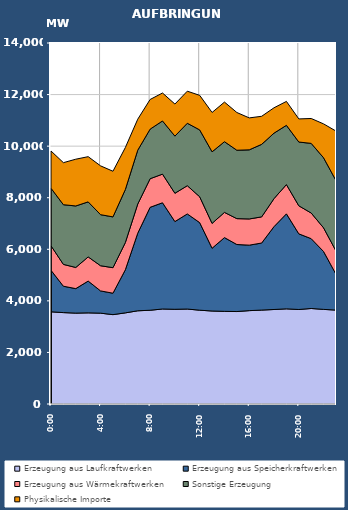
| Category | Erzeugung aus Laufkraftwerken | Erzeugung aus Speicherkraftwerken | Erzeugung aus Wärmekraftwerken | Sonstige Erzeugung | Physikalische Importe |
|---|---|---|---|---|---|
| 2007-01-17 | 3575.587 | 1609.746 | 952.126 | 2231.309 | 1443.188 |
| 2007-01-17 01:00:00 | 3544.604 | 1023.341 | 846.594 | 2314.373 | 1630.508 |
| 2007-01-17 02:00:00 | 3524.73 | 949.93 | 820.448 | 2385.029 | 1813.46 |
| 2007-01-17 03:00:00 | 3533.983 | 1233.525 | 937.279 | 2133.99 | 1753.216 |
| 2007-01-17 04:00:00 | 3522.554 | 863.671 | 976.383 | 1979.159 | 1893.788 |
| 2007-01-17 05:00:00 | 3465.896 | 830.381 | 990.576 | 1969.496 | 1770.108 |
| 2007-01-17 06:00:00 | 3534.339 | 1671.329 | 1056.262 | 2056.129 | 1628.344 |
| 2007-01-17 07:00:00 | 3614.576 | 3008.767 | 1132.171 | 2087.516 | 1201.996 |
| 2007-01-17 08:00:00 | 3635.886 | 3992.953 | 1108.821 | 1921.848 | 1150.793 |
| 2007-01-17 09:00:00 | 3684.439 | 4119.985 | 1110.249 | 2061.985 | 1083.856 |
| 2007-01-17 10:00:00 | 3673.198 | 3401.622 | 1098.136 | 2215.29 | 1243.867 |
| 2007-01-17 11:00:00 | 3682.947 | 3688.072 | 1095.248 | 2421.92 | 1243.405 |
| 2007-01-17 12:00:00 | 3637.618 | 3396.662 | 1002.679 | 2593.226 | 1339.844 |
| 2007-01-17 13:00:00 | 3606.5 | 2433.735 | 964.335 | 2775.887 | 1525.699 |
| 2007-01-17 14:00:00 | 3593.195 | 2860.025 | 977.708 | 2741.552 | 1535.854 |
| 2007-01-17 15:00:00 | 3585.725 | 2599.33 | 1004.002 | 2652.766 | 1462.363 |
| 2007-01-17 16:00:00 | 3621.037 | 2539.497 | 1016.318 | 2680.167 | 1238.372 |
| 2007-01-17 17:00:00 | 3642.132 | 2600.458 | 1014.933 | 2811.843 | 1088.318 |
| 2007-01-17 18:00:00 | 3665.146 | 3215.43 | 1086.484 | 2537.948 | 983.802 |
| 2007-01-17 19:00:00 | 3690.168 | 3684.702 | 1134.817 | 2297.743 | 927.692 |
| 2007-01-17 20:00:00 | 3665.177 | 2933.928 | 1087.792 | 2472.603 | 896.236 |
| 2007-01-17 21:00:00 | 3703.974 | 2708.237 | 993.931 | 2700.686 | 965.612 |
| 2007-01-17 22:00:00 | 3669.286 | 2242.338 | 919.091 | 2716.721 | 1315.156 |
| 2007-01-17 23:00:00 | 3641.583 | 1391.399 | 904.025 | 2729.311 | 1918.368 |